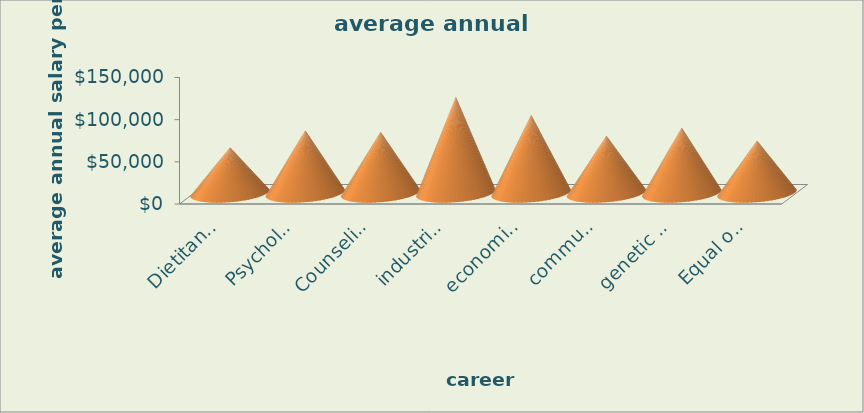
| Category | average annual salary  |
|---|---|
| Dietitans and Nutritionists | 54340 |
| Psychology Teacher | 74320 |
| Counseling Psychologists | 72540 |
| industrial organizational psychologists | 114040 |
| economics teacher | 92870 |
| communications teacher | 67820 |
| genetic counselors | 77544 |
| Equal opportunity representatives and officers  | 62140 |